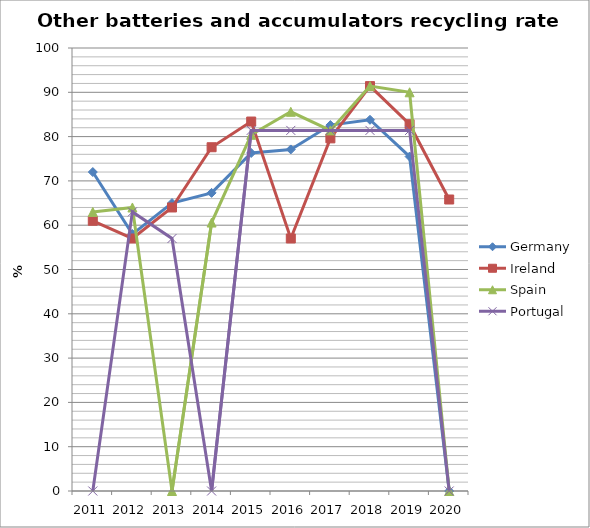
| Category | Germany | Ireland | Spain | Portugal |
|---|---|---|---|---|
| 2011 | 72 | 61 | 63 | 0 |
| 2012 | 58 | 57 | 64 | 63 |
| 2013 | 65 | 64 | 0 | 57 |
| 2014 | 67.3 | 77.6 | 60.6 | 0 |
| 2015 | 76.3 | 83.4 | 80.4 | 81.4 |
| 2016 | 77.1 | 57 | 85.6 | 81.4 |
| 2017 | 82.6 | 79.6 | 81.4 | 81.4 |
| 2018 | 83.8 | 91.4 | 91.4 | 81.4 |
| 2019 | 75.5 | 82.8 | 90 | 81.4 |
| 2020 | 0 | 65.8 | 0 | 0 |